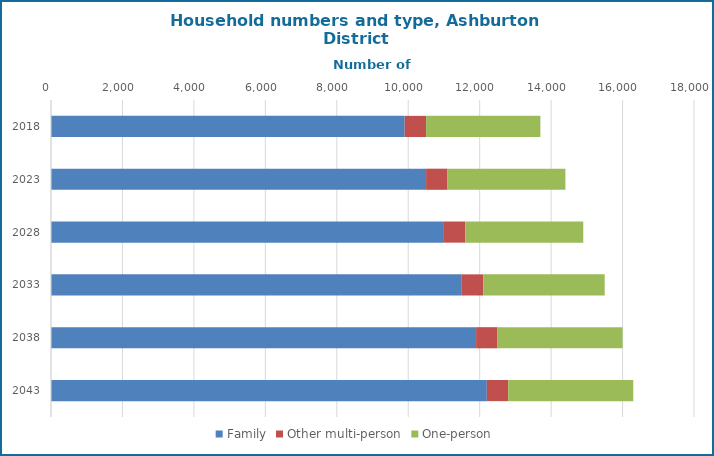
| Category | Family | Other multi-person | One-person |
|---|---|---|---|
| 2018.0 | 9900 | 600 | 3200 |
| 2023.0 | 10500 | 600 | 3300 |
| 2028.0 | 11000 | 600 | 3300 |
| 2033.0 | 11500 | 600 | 3400 |
| 2038.0 | 11900 | 600 | 3500 |
| 2043.0 | 12200 | 600 | 3500 |